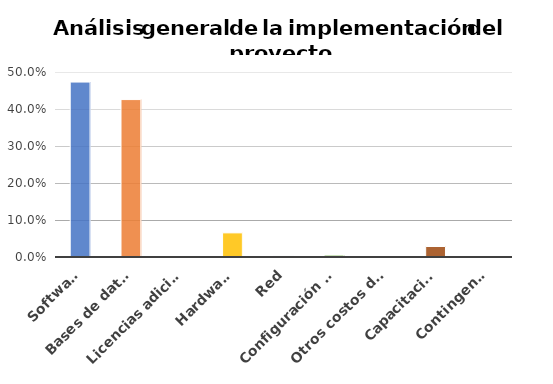
| Category | Series 0 |
|---|---|
| Software | 0.473 |
| Bases de datos | 0.425 |
| Licencias adicionales | 0 |
| Hardware | 0.065 |
| Red | 0.003 |
| Configuración del sistema | 0.005 |
| Otros costos de mano de obra | 0 |
| Capacitación | 0.028 |
| Contingencia | 0 |